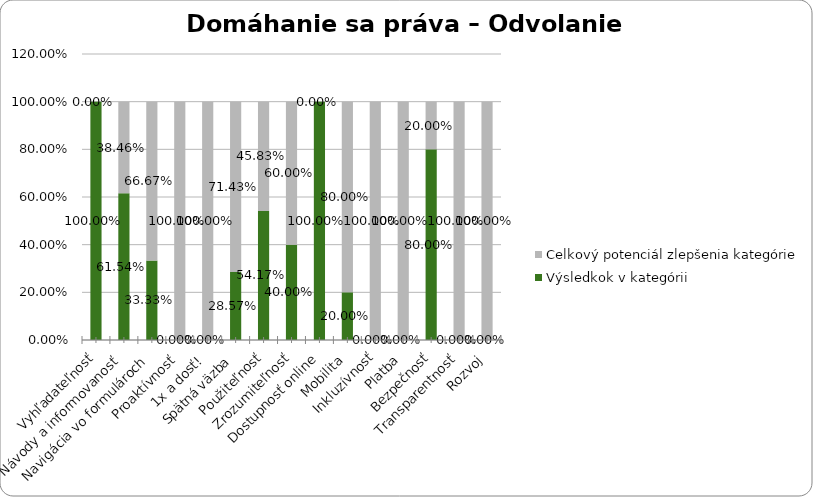
| Category | Výsledkok v kategórii | Celkový potenciál zlepšenia kategórie |
|---|---|---|
| Vyhľadateľnosť | 1 | 0 |
| Návody a informovanosť | 0.615 | 0.385 |
| Navigácia vo formulároch | 0.333 | 0.667 |
| Proaktívnosť | 0 | 1 |
| 1x a dosť! | 0 | 1 |
| Spätná väzba | 0.286 | 0.714 |
| Použiteľnosť | 0.542 | 0.458 |
| Zrozumiteľnosť | 0.4 | 0.6 |
| Dostupnosť online | 1 | 0 |
| Mobilita | 0.2 | 0.8 |
| Inkluzívnosť | 0 | 1 |
| Platba | 0 | 1 |
| Bezpečnosť | 0.8 | 0.2 |
| Transparentnosť | 0 | 1 |
| Rozvoj | 0 | 1 |